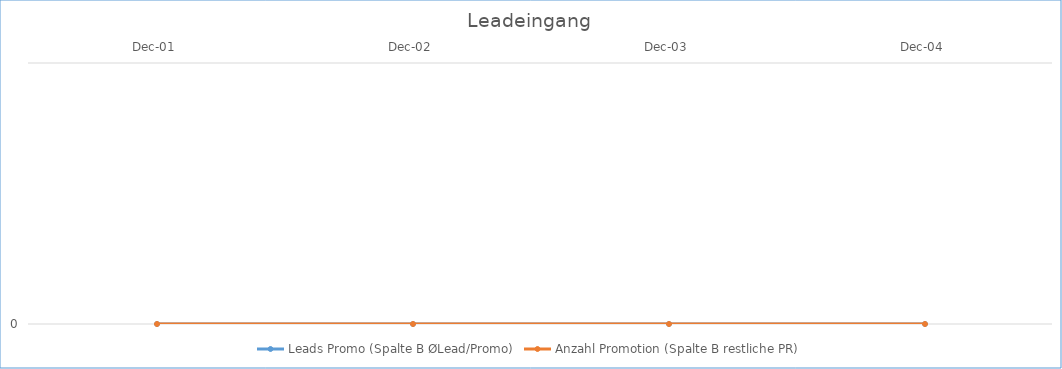
| Category | Leads Promo (Spalte B ØLead/Promo) | Anzahl Promotion (Spalte B restliche PR) |
|---|---|---|
| 2001-12-01 | 0 | 0 |
| 2002-12-01 | 0 | 0 |
| 2003-12-01 | 0 | 0 |
| 2004-12-01 | 0 | 0 |